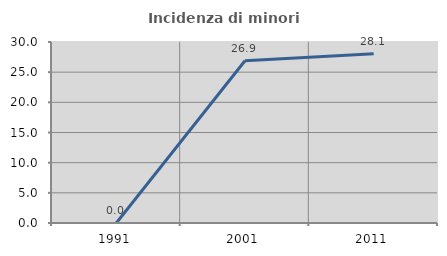
| Category | Incidenza di minori stranieri |
|---|---|
| 1991.0 | 0 |
| 2001.0 | 26.897 |
| 2011.0 | 28.059 |